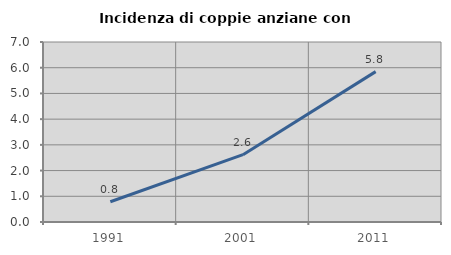
| Category | Incidenza di coppie anziane con figli |
|---|---|
| 1991.0 | 0.787 |
| 2001.0 | 2.618 |
| 2011.0 | 5.848 |